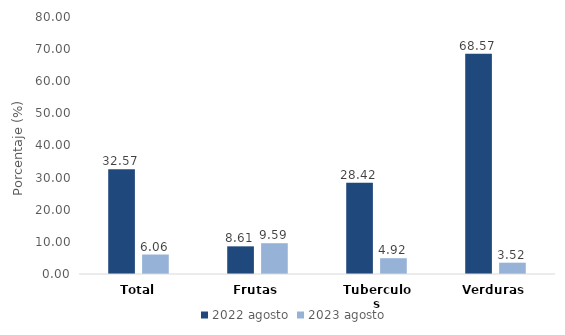
| Category | 2022 | 2023 |
|---|---|---|
| Total | 32.572 | 6.064 |
| Frutas | 8.61 | 9.586 |
| Tuberculos | 28.417 | 4.916 |
| Verduras | 68.569 | 3.52 |